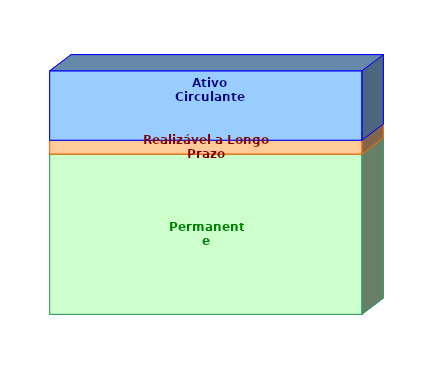
| Category | Permanente | Realizável a Longo Prazo | Ativo Circulante |
|---|---|---|---|
| 0 | 0.659 | 0.057 | 0.285 |